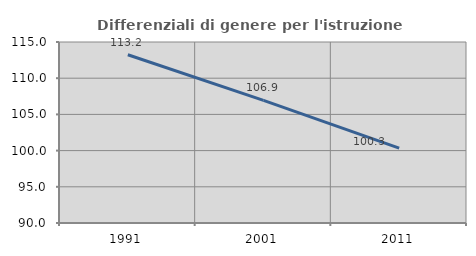
| Category | Differenziali di genere per l'istruzione superiore |
|---|---|
| 1991.0 | 113.238 |
| 2001.0 | 106.928 |
| 2011.0 | 100.33 |